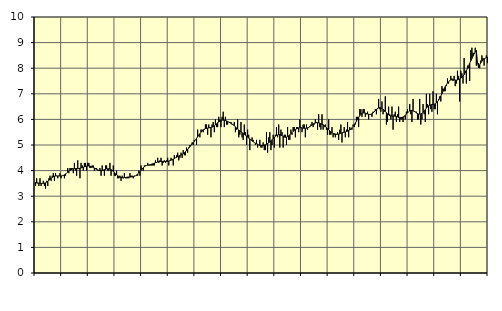
| Category | Information och kommunikation, SNI 58-63 | Series 1 |
|---|---|---|
| nan | 3.4 | 3.54 |
| 87.0 | 3.7 | 3.52 |
| 87.0 | 3.5 | 3.52 |
| 87.0 | 3.4 | 3.51 |
| 87.0 | 3.7 | 3.51 |
| 87.0 | 3.4 | 3.5 |
| 87.0 | 3.5 | 3.5 |
| 87.0 | 3.6 | 3.5 |
| 87.0 | 3.4 | 3.51 |
| 87.0 | 3.3 | 3.52 |
| 87.0 | 3.6 | 3.55 |
| 87.0 | 3.4 | 3.58 |
| nan | 3.7 | 3.62 |
| 88.0 | 3.8 | 3.66 |
| 88.0 | 3.6 | 3.7 |
| 88.0 | 3.8 | 3.73 |
| 88.0 | 3.9 | 3.76 |
| 88.0 | 3.6 | 3.78 |
| 88.0 | 3.9 | 3.79 |
| 88.0 | 3.8 | 3.79 |
| 88.0 | 3.7 | 3.79 |
| 88.0 | 3.8 | 3.79 |
| 88.0 | 3.9 | 3.79 |
| 88.0 | 3.7 | 3.79 |
| nan | 3.8 | 3.8 |
| 89.0 | 3.8 | 3.81 |
| 89.0 | 3.7 | 3.84 |
| 89.0 | 3.8 | 3.87 |
| 89.0 | 3.9 | 3.9 |
| 89.0 | 4.1 | 3.94 |
| 89.0 | 3.9 | 3.97 |
| 89.0 | 4.1 | 4.01 |
| 89.0 | 4.1 | 4.03 |
| 89.0 | 4.1 | 4.06 |
| 89.0 | 3.9 | 4.07 |
| 89.0 | 4.3 | 4.07 |
| nan | 4 | 4.08 |
| 90.0 | 3.8 | 4.08 |
| 90.0 | 4.4 | 4.08 |
| 90.0 | 4.1 | 4.08 |
| 90.0 | 3.7 | 4.09 |
| 90.0 | 4.3 | 4.1 |
| 90.0 | 4.2 | 4.12 |
| 90.0 | 4 | 4.13 |
| 90.0 | 4.3 | 4.15 |
| 90.0 | 4.3 | 4.16 |
| 90.0 | 4 | 4.17 |
| 90.0 | 4.3 | 4.18 |
| nan | 4.3 | 4.18 |
| 91.0 | 4.1 | 4.17 |
| 91.0 | 4.1 | 4.16 |
| 91.0 | 4.2 | 4.14 |
| 91.0 | 4.2 | 4.12 |
| 91.0 | 4 | 4.1 |
| 91.0 | 4.1 | 4.07 |
| 91.0 | 4.1 | 4.05 |
| 91.0 | 4 | 4.03 |
| 91.0 | 4 | 4.01 |
| 91.0 | 4.1 | 4 |
| 91.0 | 3.8 | 4 |
| nan | 4.2 | 4.01 |
| 92.0 | 4 | 4.02 |
| 92.0 | 3.8 | 4.04 |
| 92.0 | 4.2 | 4.05 |
| 92.0 | 4.2 | 4.07 |
| 92.0 | 4 | 4.07 |
| 92.0 | 4 | 4.07 |
| 92.0 | 4.3 | 4.06 |
| 92.0 | 3.8 | 4.04 |
| 92.0 | 4 | 4.01 |
| 92.0 | 4.2 | 3.97 |
| 92.0 | 3.8 | 3.92 |
| nan | 3.8 | 3.88 |
| 93.0 | 4 | 3.83 |
| 93.0 | 3.7 | 3.8 |
| 93.0 | 3.7 | 3.77 |
| 93.0 | 3.8 | 3.74 |
| 93.0 | 3.6 | 3.73 |
| 93.0 | 3.8 | 3.72 |
| 93.0 | 3.7 | 3.72 |
| 93.0 | 3.9 | 3.73 |
| 93.0 | 3.7 | 3.73 |
| 93.0 | 3.7 | 3.74 |
| 93.0 | 3.7 | 3.75 |
| nan | 3.7 | 3.75 |
| 94.0 | 3.9 | 3.75 |
| 94.0 | 3.8 | 3.75 |
| 94.0 | 3.8 | 3.76 |
| 94.0 | 3.7 | 3.77 |
| 94.0 | 3.8 | 3.78 |
| 94.0 | 3.8 | 3.8 |
| 94.0 | 3.8 | 3.83 |
| 94.0 | 3.8 | 3.87 |
| 94.0 | 4 | 3.91 |
| 94.0 | 3.8 | 3.96 |
| 94.0 | 4.2 | 4.01 |
| nan | 4.1 | 4.06 |
| 95.0 | 4 | 4.11 |
| 95.0 | 4.2 | 4.15 |
| 95.0 | 4.2 | 4.18 |
| 95.0 | 4.2 | 4.2 |
| 95.0 | 4.3 | 4.21 |
| 95.0 | 4.2 | 4.22 |
| 95.0 | 4.2 | 4.23 |
| 95.0 | 4.2 | 4.24 |
| 95.0 | 4.2 | 4.26 |
| 95.0 | 4.2 | 4.27 |
| 95.0 | 4.2 | 4.29 |
| nan | 4.4 | 4.31 |
| 96.0 | 4.3 | 4.32 |
| 96.0 | 4.5 | 4.34 |
| 96.0 | 4.3 | 4.35 |
| 96.0 | 4.4 | 4.36 |
| 96.0 | 4.5 | 4.36 |
| 96.0 | 4.2 | 4.36 |
| 96.0 | 4.3 | 4.36 |
| 96.0 | 4.4 | 4.36 |
| 96.0 | 4.3 | 4.36 |
| 96.0 | 4.4 | 4.36 |
| 96.0 | 4.5 | 4.36 |
| nan | 4.2 | 4.37 |
| 97.0 | 4.4 | 4.39 |
| 97.0 | 4.5 | 4.41 |
| 97.0 | 4.4 | 4.43 |
| 97.0 | 4.2 | 4.45 |
| 97.0 | 4.6 | 4.47 |
| 97.0 | 4.5 | 4.5 |
| 97.0 | 4.6 | 4.52 |
| 97.0 | 4.7 | 4.55 |
| 97.0 | 4.4 | 4.57 |
| 97.0 | 4.5 | 4.59 |
| 97.0 | 4.7 | 4.61 |
| nan | 4.5 | 4.63 |
| 98.0 | 4.8 | 4.66 |
| 98.0 | 4.6 | 4.7 |
| 98.0 | 4.6 | 4.74 |
| 98.0 | 4.9 | 4.78 |
| 98.0 | 4.7 | 4.83 |
| 98.0 | 4.9 | 4.88 |
| 98.0 | 5 | 4.93 |
| 98.0 | 5 | 4.99 |
| 98.0 | 5.1 | 5.04 |
| 98.0 | 5 | 5.09 |
| 98.0 | 5.2 | 5.14 |
| nan | 5.2 | 5.2 |
| 99.0 | 5 | 5.26 |
| 99.0 | 5.6 | 5.32 |
| 99.0 | 5.4 | 5.38 |
| 99.0 | 5.3 | 5.44 |
| 99.0 | 5.6 | 5.5 |
| 99.0 | 5.6 | 5.55 |
| 99.0 | 5.5 | 5.59 |
| 99.0 | 5.6 | 5.62 |
| 99.0 | 5.8 | 5.64 |
| 99.0 | 5.8 | 5.65 |
| 99.0 | 5.4 | 5.66 |
| nan | 5.8 | 5.67 |
| 0.0 | 5.7 | 5.68 |
| 0.0 | 5.3 | 5.69 |
| 0.0 | 5.8 | 5.7 |
| 0.0 | 5.9 | 5.72 |
| 0.0 | 5.5 | 5.75 |
| 0.0 | 6 | 5.78 |
| 0.0 | 5.7 | 5.83 |
| 0.0 | 5.7 | 5.87 |
| 0.0 | 6.1 | 5.9 |
| 0.0 | 6 | 5.93 |
| 0.0 | 5.7 | 5.95 |
| nan | 6.1 | 5.97 |
| 1.0 | 6.3 | 5.97 |
| 1.0 | 5.7 | 5.97 |
| 1.0 | 6.1 | 5.95 |
| 1.0 | 5.8 | 5.94 |
| 1.0 | 5.8 | 5.92 |
| 1.0 | 5.9 | 5.9 |
| 1.0 | 5.9 | 5.87 |
| 1.0 | 5.9 | 5.85 |
| 1.0 | 5.8 | 5.82 |
| 1.0 | 5.8 | 5.79 |
| 1.0 | 5.9 | 5.75 |
| nan | 5.5 | 5.71 |
| 2.0 | 5.6 | 5.67 |
| 2.0 | 6 | 5.62 |
| 2.0 | 5.3 | 5.58 |
| 2.0 | 5.4 | 5.55 |
| 2.0 | 5.9 | 5.51 |
| 2.0 | 5.3 | 5.48 |
| 2.0 | 5.2 | 5.45 |
| 2.0 | 5.8 | 5.42 |
| 2.0 | 5.5 | 5.38 |
| 2.0 | 5 | 5.35 |
| 2.0 | 5.6 | 5.31 |
| nan | 5.4 | 5.27 |
| 3.0 | 4.8 | 5.24 |
| 3.0 | 5.2 | 5.2 |
| 3.0 | 5.3 | 5.16 |
| 3.0 | 5.2 | 5.13 |
| 3.0 | 5.1 | 5.1 |
| 3.0 | 5 | 5.07 |
| 3.0 | 5.2 | 5.05 |
| 3.0 | 4.9 | 5.03 |
| 3.0 | 5 | 5 |
| 3.0 | 5.2 | 4.99 |
| 3.0 | 4.9 | 4.98 |
| nan | 4.9 | 4.98 |
| 4.0 | 5.1 | 4.98 |
| 4.0 | 4.8 | 5 |
| 4.0 | 4.8 | 5.01 |
| 4.0 | 5.5 | 5.03 |
| 4.0 | 4.7 | 5.06 |
| 4.0 | 5.3 | 5.09 |
| 4.0 | 5.5 | 5.12 |
| 4.0 | 4.8 | 5.16 |
| 4.0 | 5 | 5.21 |
| 4.0 | 5.4 | 5.25 |
| 4.0 | 4.9 | 5.3 |
| nan | 5.4 | 5.34 |
| 5.0 | 5.7 | 5.37 |
| 5.0 | 5.3 | 5.39 |
| 5.0 | 5.8 | 5.4 |
| 5.0 | 4.9 | 5.4 |
| 5.0 | 5.6 | 5.38 |
| 5.0 | 5.5 | 5.36 |
| 5.0 | 4.9 | 5.33 |
| 5.0 | 5.4 | 5.31 |
| 5.0 | 5.4 | 5.3 |
| 5.0 | 5 | 5.31 |
| 5.0 | 5.7 | 5.33 |
| nan | 5.2 | 5.36 |
| 6.0 | 5.2 | 5.4 |
| 6.0 | 5.6 | 5.44 |
| 6.0 | 5.4 | 5.48 |
| 6.0 | 5.7 | 5.53 |
| 6.0 | 5.7 | 5.57 |
| 6.0 | 5.3 | 5.6 |
| 6.0 | 5.7 | 5.63 |
| 6.0 | 5.7 | 5.65 |
| 6.0 | 5.5 | 5.67 |
| 6.0 | 6 | 5.67 |
| 6.0 | 5.7 | 5.67 |
| nan | 5.5 | 5.66 |
| 7.0 | 5.8 | 5.66 |
| 7.0 | 5.8 | 5.65 |
| 7.0 | 5.3 | 5.65 |
| 7.0 | 5.8 | 5.66 |
| 7.0 | 5.6 | 5.67 |
| 7.0 | 5.7 | 5.69 |
| 7.0 | 5.7 | 5.72 |
| 7.0 | 5.8 | 5.75 |
| 7.0 | 5.9 | 5.79 |
| 7.0 | 5.7 | 5.82 |
| 7.0 | 5.8 | 5.84 |
| nan | 6 | 5.86 |
| 8.0 | 5.9 | 5.87 |
| 8.0 | 5.6 | 5.87 |
| 8.0 | 6.2 | 5.86 |
| 8.0 | 5.7 | 5.85 |
| 8.0 | 5.6 | 5.83 |
| 8.0 | 6.2 | 5.81 |
| 8.0 | 5.6 | 5.79 |
| 8.0 | 5.7 | 5.76 |
| 8.0 | 5.8 | 5.72 |
| 8.0 | 5.6 | 5.68 |
| 8.0 | 5.4 | 5.64 |
| nan | 6 | 5.6 |
| 9.0 | 5.4 | 5.55 |
| 9.0 | 5.4 | 5.51 |
| 9.0 | 5.7 | 5.48 |
| 9.0 | 5.3 | 5.45 |
| 9.0 | 5.4 | 5.44 |
| 9.0 | 5.3 | 5.43 |
| 9.0 | 5.4 | 5.42 |
| 9.0 | 5.5 | 5.42 |
| 9.0 | 5.2 | 5.43 |
| 9.0 | 5.6 | 5.44 |
| 9.0 | 5.8 | 5.46 |
| nan | 5.1 | 5.47 |
| 10.0 | 5.5 | 5.49 |
| 10.0 | 5.7 | 5.5 |
| 10.0 | 5.3 | 5.51 |
| 10.0 | 5.6 | 5.53 |
| 10.0 | 5.9 | 5.54 |
| 10.0 | 5.3 | 5.57 |
| 10.0 | 5.7 | 5.59 |
| 10.0 | 5.6 | 5.63 |
| 10.0 | 5.6 | 5.67 |
| 10.0 | 5.8 | 5.72 |
| 10.0 | 5.7 | 5.78 |
| nan | 5.8 | 5.85 |
| 11.0 | 6.1 | 5.93 |
| 11.0 | 6.1 | 6.01 |
| 11.0 | 5.7 | 6.08 |
| 11.0 | 6.4 | 6.15 |
| 11.0 | 6.4 | 6.2 |
| 11.0 | 6.1 | 6.24 |
| 11.0 | 6.4 | 6.25 |
| 11.0 | 6.4 | 6.26 |
| 11.0 | 6.1 | 6.25 |
| 11.0 | 6.2 | 6.23 |
| 11.0 | 6.3 | 6.21 |
| nan | 6 | 6.2 |
| 12.0 | 6.2 | 6.19 |
| 12.0 | 6.2 | 6.2 |
| 12.0 | 6.1 | 6.22 |
| 12.0 | 6.3 | 6.25 |
| 12.0 | 6.3 | 6.29 |
| 12.0 | 6.4 | 6.34 |
| 12.0 | 6.2 | 6.39 |
| 12.0 | 6.4 | 6.43 |
| 12.0 | 6.8 | 6.45 |
| 12.0 | 6.4 | 6.46 |
| 12.0 | 6.3 | 6.45 |
| nan | 6.7 | 6.43 |
| 13.0 | 6.2 | 6.4 |
| 13.0 | 6.3 | 6.36 |
| 13.0 | 6.9 | 6.31 |
| 13.0 | 5.8 | 6.26 |
| 13.0 | 5.9 | 6.22 |
| 13.0 | 6.5 | 6.18 |
| 13.0 | 6.2 | 6.15 |
| 13.0 | 6 | 6.14 |
| 13.0 | 6.5 | 6.13 |
| 13.0 | 5.6 | 6.13 |
| 13.0 | 6.2 | 6.13 |
| nan | 6.3 | 6.12 |
| 14.0 | 5.9 | 6.11 |
| 14.0 | 6.2 | 6.1 |
| 14.0 | 6.5 | 6.08 |
| 14.0 | 5.9 | 6.07 |
| 14.0 | 6 | 6.07 |
| 14.0 | 6 | 6.08 |
| 14.0 | 5.9 | 6.09 |
| 14.0 | 6.1 | 6.12 |
| 14.0 | 6 | 6.16 |
| 14.0 | 6.3 | 6.21 |
| 14.0 | 6.4 | 6.25 |
| nan | 6.3 | 6.3 |
| 15.0 | 6.6 | 6.33 |
| 15.0 | 6.2 | 6.35 |
| 15.0 | 5.9 | 6.35 |
| 15.0 | 6.8 | 6.34 |
| 15.0 | 6.3 | 6.32 |
| 15.0 | 6.3 | 6.29 |
| 15.0 | 6.3 | 6.25 |
| 15.0 | 6 | 6.23 |
| 15.0 | 6 | 6.21 |
| 15.0 | 6.8 | 6.21 |
| 15.0 | 5.8 | 6.21 |
| nan | 6 | 6.24 |
| 16.0 | 6.6 | 6.28 |
| 16.0 | 6.2 | 6.32 |
| 16.0 | 5.9 | 6.38 |
| 16.0 | 7 | 6.44 |
| 16.0 | 6.6 | 6.49 |
| 16.0 | 6.2 | 6.53 |
| 16.0 | 7 | 6.55 |
| 16.0 | 6.4 | 6.57 |
| 16.0 | 6.3 | 6.58 |
| 16.0 | 7.1 | 6.58 |
| 16.0 | 6.4 | 6.59 |
| nan | 6.4 | 6.61 |
| 17.0 | 7 | 6.64 |
| 17.0 | 6.2 | 6.69 |
| 17.0 | 6.8 | 6.75 |
| 17.0 | 6.9 | 6.83 |
| 17.0 | 6.7 | 6.91 |
| 17.0 | 7.3 | 7 |
| 17.0 | 7.2 | 7.1 |
| 17.0 | 7.1 | 7.19 |
| 17.0 | 7.1 | 7.28 |
| 17.0 | 7.3 | 7.35 |
| 17.0 | 7.6 | 7.42 |
| nan | 7.4 | 7.47 |
| 18.0 | 7.5 | 7.51 |
| 18.0 | 7.7 | 7.54 |
| 18.0 | 7.6 | 7.55 |
| 18.0 | 7.5 | 7.55 |
| 18.0 | 7.7 | 7.55 |
| 18.0 | 7.3 | 7.54 |
| 18.0 | 7.4 | 7.53 |
| 18.0 | 7.9 | 7.54 |
| 18.0 | 7.7 | 7.56 |
| 18.0 | 6.7 | 7.58 |
| 18.0 | 7.9 | 7.61 |
| nan | 7.8 | 7.65 |
| 19.0 | 7.4 | 7.69 |
| 19.0 | 8.4 | 7.75 |
| 19.0 | 7.9 | 7.82 |
| 19.0 | 7.4 | 7.9 |
| 19.0 | 8.1 | 8 |
| 19.0 | 8 | 8.09 |
| 19.0 | 7.5 | 8.19 |
| 19.0 | 8.7 | 8.29 |
| 19.0 | 8.8 | 8.38 |
| 19.0 | 8.6 | 8.47 |
| 19.0 | 8.6 | 8.56 |
| nan | 8.8 | 8.63 |
| 20.0 | 8.1 | 8.69 |
| 20.0 | 8.2 | 8.24 |
| 20.0 | 8.2 | 8.02 |
| 20.0 | 8 | 8.13 |
| 20.0 | 8.3 | 8.21 |
| 20.0 | 8.5 | 8.27 |
| 20.0 | 8.4 | 8.32 |
| 20.0 | 8.1 | 8.36 |
| 20.0 | 8.4 | 8.39 |
| 20.0 | 8.5 | 8.42 |
| 20.0 | 8.2 | 8.44 |